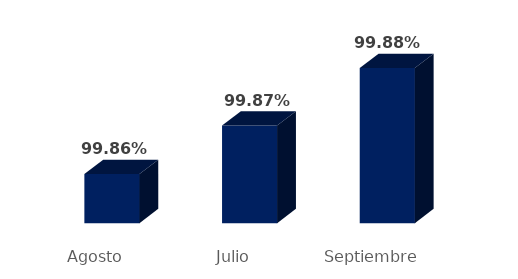
| Category | Porcentaje |
|---|---|
| Agosto | 0.999 |
| Julio | 0.999 |
| Septiembre | 0.999 |